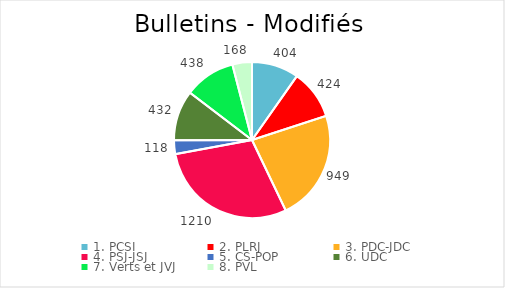
| Category | Series 0 |
|---|---|
| 1. PCSI | 404 |
| 2. PLRJ | 424 |
| 3. PDC-JDC | 949 |
| 4. PSJ-JSJ | 1210 |
| 5. CS-POP | 118 |
| 6. UDC | 432 |
| 7. Verts et JVJ | 438 |
| 8. PVL | 168 |